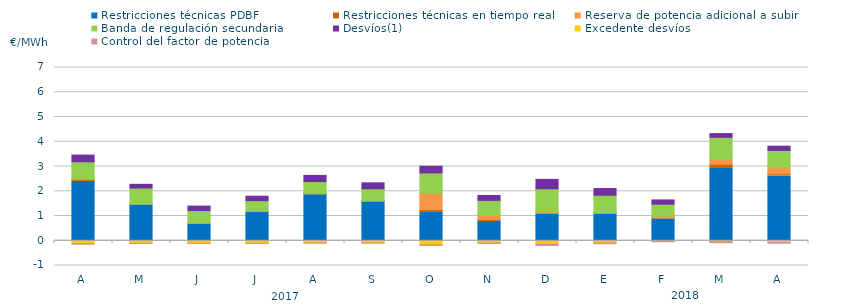
| Category | Restricciones técnicas PDBF | Restricciones técnicas en tiempo real | Reserva de potencia adicional a subir | Banda de regulación secundaria | Desvíos(1) | Excedente desvíos | Control del factor de potencia |
|---|---|---|---|---|---|---|---|
| A | 2.4 | 0.09 | 0.01 | 0.69 | 0.27 | -0.12 | -0.06 |
| M | 1.45 | 0.03 | 0 | 0.65 | 0.15 | -0.1 | -0.05 |
| J | 0.69 | 0.02 | 0.01 | 0.5 | 0.18 | -0.1 | -0.05 |
| J | 1.14 | 0.05 | 0 | 0.43 | 0.18 | -0.1 | -0.05 |
| A | 1.86 | 0.05 | 0.02 | 0.46 | 0.25 | -0.09 | -0.05 |
| S | 1.55 | 0.05 | 0.03 | 0.47 | 0.24 | -0.09 | -0.05 |
| O | 1.14 | 0.12 | 0.66 | 0.82 | 0.27 | -0.17 | -0.06 |
| N | 0.78 | 0.08 | 0.17 | 0.6 | 0.2 | -0.09 | -0.06 |
| D | 1.08 | 0.05 | 0.03 | 0.94 | 0.38 | -0.15 | -0.08 |
| E | 1.07 | 0.05 | 0.02 | 0.7 | 0.27 | -0.09 | -0.07 |
| F | 0.88 | 0.05 | 0.06 | 0.49 | 0.17 | -0.02 | -0.06 |
| M | 2.92 | 0.17 | 0.2 | 0.89 | 0.15 | -0.04 | -0.08 |
| A | 2.61 | 0.09 | 0.27 | 0.68 | 0.17 | -0.07 | -0.07 |